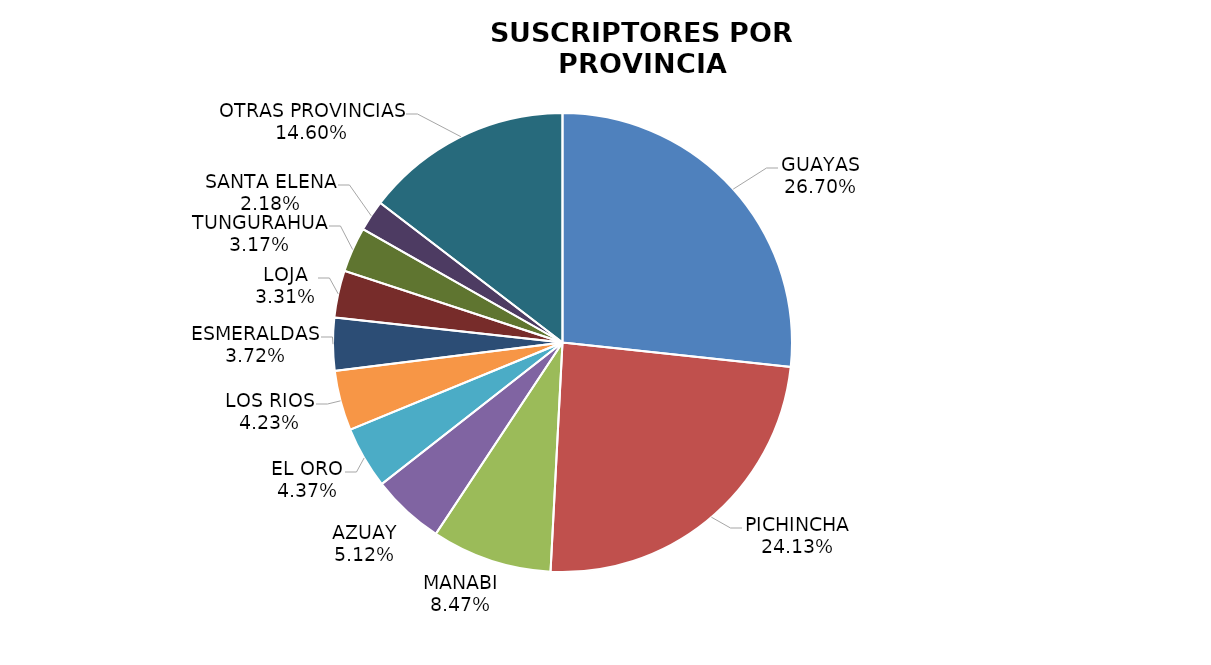
| Category | Series 0 |
|---|---|
| GUAYAS | 141517.677 |
| PICHINCHA | 127878.17 |
| MANABI | 44908.494 |
| AZUAY | 27138.823 |
| EL ORO | 23171.968 |
| LOS RIOS | 22395.491 |
| ESMERALDAS | 19722.415 |
| LOJA | 17527.539 |
| TUNGURAHUA | 16790.645 |
| SANTA ELENA | 11576.569 |
| OTRAS PROVINCIAS | 77358.431 |